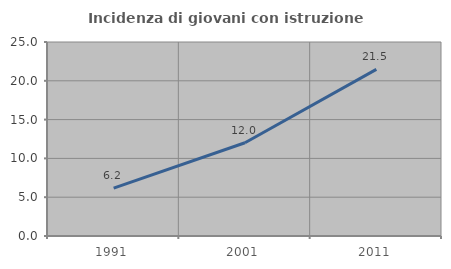
| Category | Incidenza di giovani con istruzione universitaria |
|---|---|
| 1991.0 | 6.164 |
| 2001.0 | 12.019 |
| 2011.0 | 21.466 |